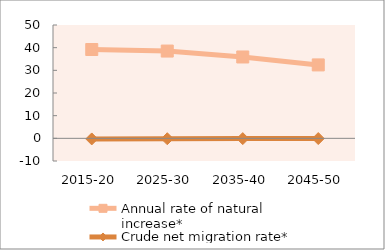
| Category | Annual rate of natural increase* | Crude net migration rate* |
|---|---|---|
| 2015-20 | 39.185 | -0.267 |
| 2025-30 | 38.506 | -0.181 |
| 2035-40 | 35.891 | -0.125 |
| 2045-50 | 32.389 | -0.089 |